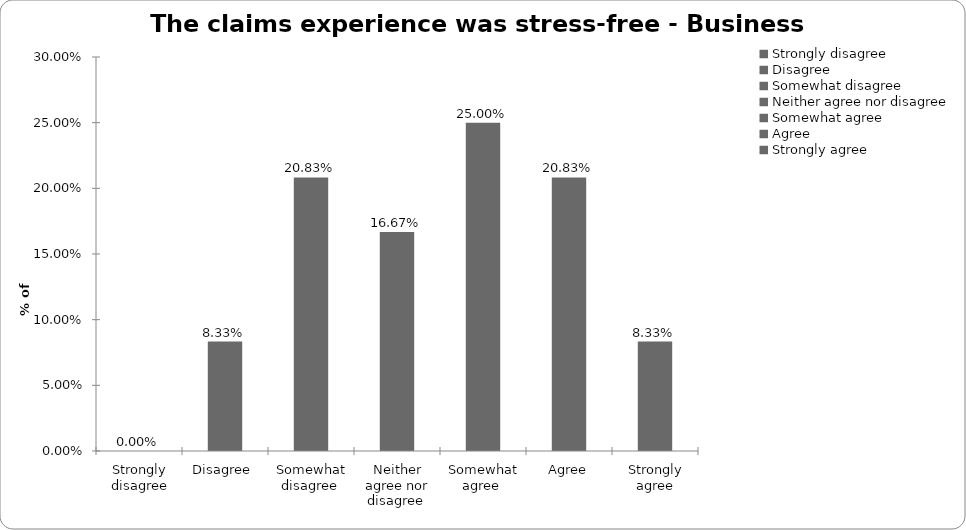
| Category | Series 0 |
|---|---|
| Strongly disagree | 0 |
| Disagree  | 0.083 |
| Somewhat disagree  | 0.208 |
| Neither agree nor disagree  | 0.167 |
| Somewhat agree  | 0.25 |
| Agree | 0.208 |
| Strongly agree | 0.083 |